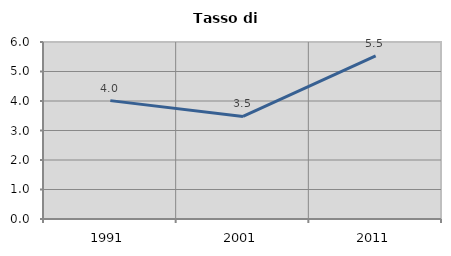
| Category | Tasso di disoccupazione   |
|---|---|
| 1991.0 | 4.012 |
| 2001.0 | 3.477 |
| 2011.0 | 5.533 |